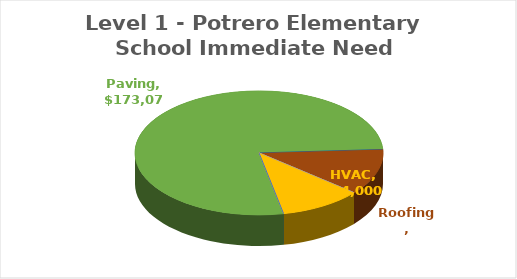
| Category | Series 0 |
|---|---|
| Electrical | 0 |
| Fencing | 0 |
| Finishes | 0 |
| HVAC | 24000 |
| LowVoltage | 0 |
| Paving | 173069.65 |
| Plumbing | 0 |
| Roofing | 26880 |
| Playground | 0 |